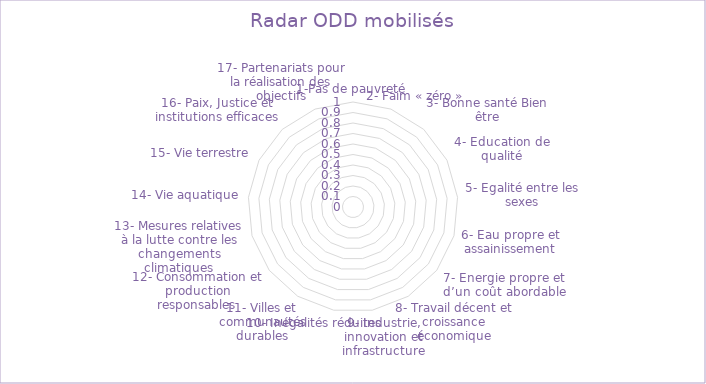
| Category | Series 0 |
|---|---|
| 1-Pas de pauvreté | 0 |
| 2- Faim « zéro » | 0 |
| 3- Bonne santé Bien être | 0 |
| 4- Education de qualité | 0 |
| 5- Egalité entre les sexes | 0 |
| 6- Eau propre et assainissement | 0 |
| 7- Energie propre et d’un coût abordable | 0 |
| 8- Travail décent et croissance économique | 0 |
| 9- Industrie, innovation et infrastructure | 0 |
| 10- Inégalités réduites | 0 |
| 11- Villes et communautés durables | 0 |
| 12- Consommation et production responsables | 0 |
| 13- Mesures relatives à la lutte contre les changements climatiques | 0 |
| 14- Vie aquatique | 0 |
| 15- Vie terrestre | 0 |
| 16- Paix, Justice et institutions efficaces | 0 |
| 17- Partenariats pour la réalisation des objectifs | 0 |